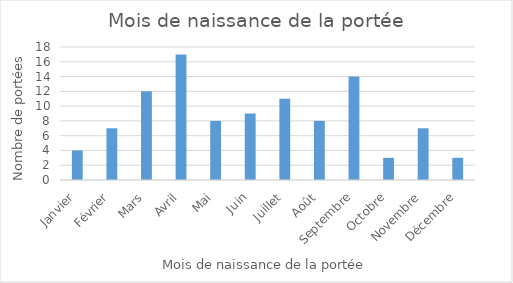
| Category | Series 0 |
|---|---|
| Janvier | 4 |
| Février | 7 |
| Mars | 12 |
| Avril | 17 |
| Mai | 8 |
| Juin | 9 |
| Juillet | 11 |
| Août | 8 |
| Septembre | 14 |
| Octobre | 3 |
| Novembre | 7 |
| Décembre | 3 |